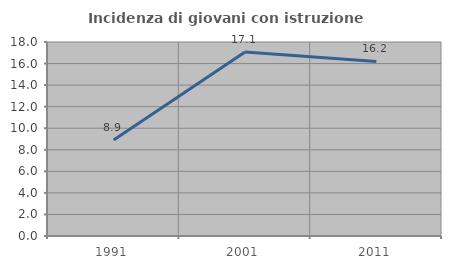
| Category | Incidenza di giovani con istruzione universitaria |
|---|---|
| 1991.0 | 8.906 |
| 2001.0 | 17.073 |
| 2011.0 | 16.201 |